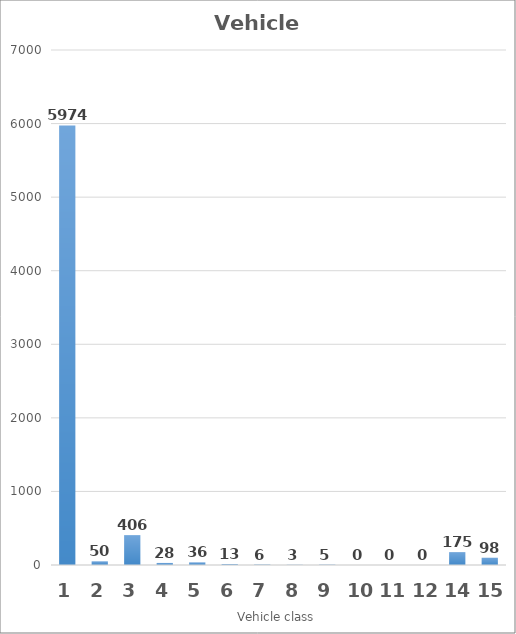
| Category | Series 0 |
|---|---|
| 1.0 | 5974 |
| 2.0 | 50 |
| 3.0 | 406 |
| 4.0 | 28 |
| 5.0 | 36 |
| 6.0 | 13 |
| 7.0 | 6 |
| 8.0 | 3 |
| 9.0 | 5 |
| 10.0 | 0 |
| 11.0 | 0 |
| 12.0 | 0 |
| 14.0 | 175 |
| 15.0 | 98 |